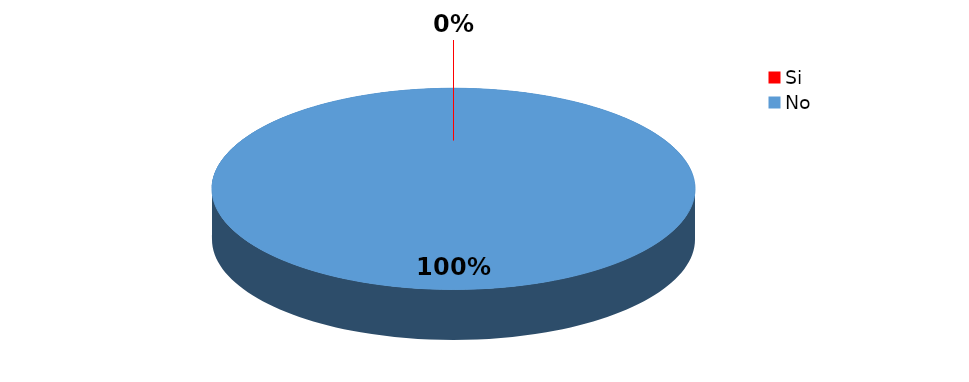
| Category | Series 0 |
|---|---|
| Si | 0 |
| No | 21 |